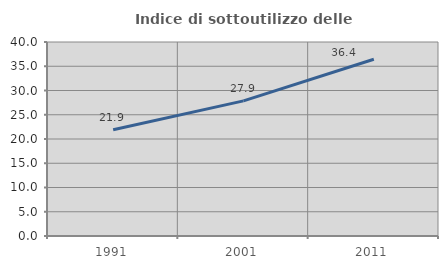
| Category | Indice di sottoutilizzo delle abitazioni  |
|---|---|
| 1991.0 | 21.925 |
| 2001.0 | 27.854 |
| 2011.0 | 36.439 |